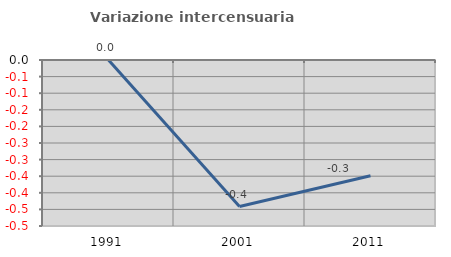
| Category | Variazione intercensuaria annua |
|---|---|
| 1991.0 | 0 |
| 2001.0 | -0.441 |
| 2011.0 | -0.349 |